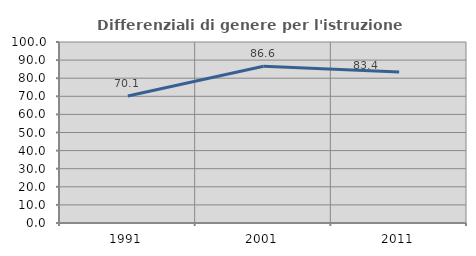
| Category | Differenziali di genere per l'istruzione superiore |
|---|---|
| 1991.0 | 70.139 |
| 2001.0 | 86.624 |
| 2011.0 | 83.417 |